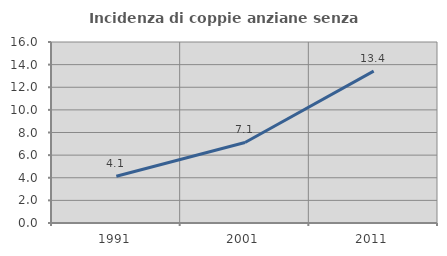
| Category | Incidenza di coppie anziane senza figli  |
|---|---|
| 1991.0 | 4.135 |
| 2001.0 | 7.119 |
| 2011.0 | 13.423 |